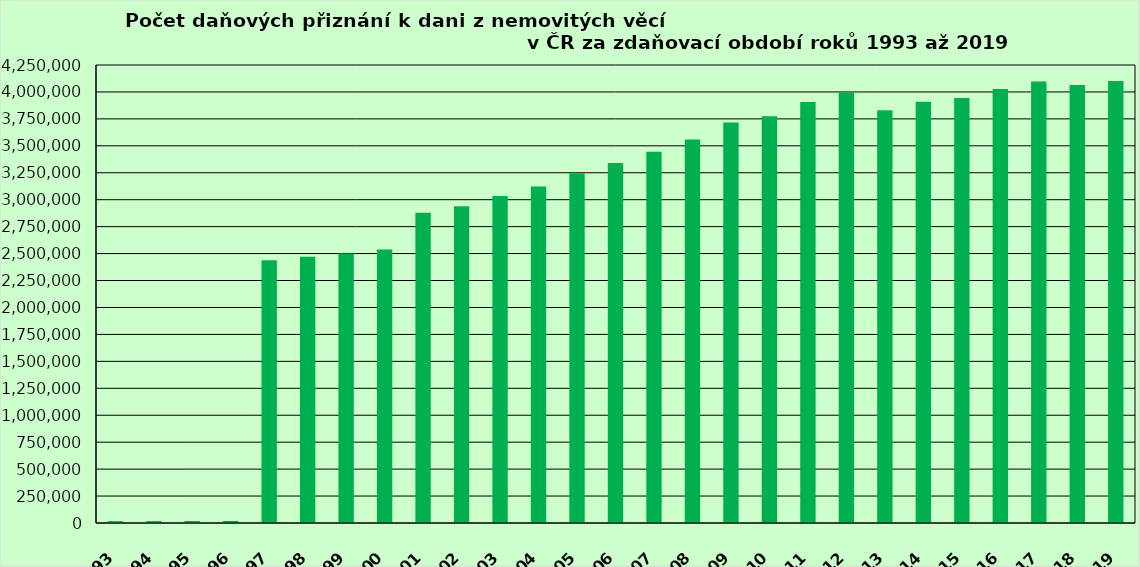
| Category | Series 0 |
|---|---|
| 1993.0 | 17588 |
| 1994.0 | 17987 |
| 1995.0 | 18600 |
| 1996.0 | 18996 |
| 1997.0 | 2439143 |
| 1998.0 | 2470419 |
| 1999.0 | 2500868 |
| 2000.0 | 2536826 |
| 2001.0 | 2879285 |
| 2002.0 | 2938433 |
| 2003.0 | 3034585 |
| 2004.0 | 3121985 |
| 2005.0 | 3246310 |
| 2006.0 | 3340780 |
| 2007.0 | 3446095 |
| 2008.0 | 3558492 |
| 2009.0 | 3715437 |
| 2010.0 | 3775003 |
| 2011.0 | 3906128 |
| 2012.0 | 3992700 |
| 2013.0 | 3830554 |
| 2014.0 | 3907859 |
| 2015.0 | 3942889 |
| 2016.0 | 4027492 |
| 2017.0 | 4096689 |
| 2018.0 | 4064464 |
| 2019.0 | 4102111 |